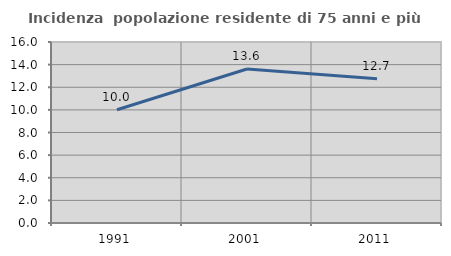
| Category | Incidenza  popolazione residente di 75 anni e più |
|---|---|
| 1991.0 | 10.015 |
| 2001.0 | 13.613 |
| 2011.0 | 12.741 |